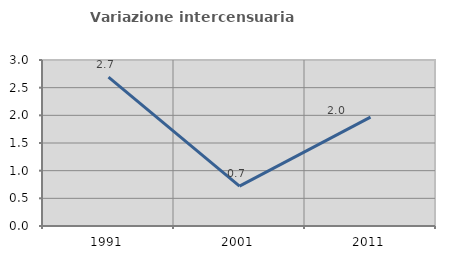
| Category | Variazione intercensuaria annua |
|---|---|
| 1991.0 | 2.689 |
| 2001.0 | 0.72 |
| 2011.0 | 1.967 |